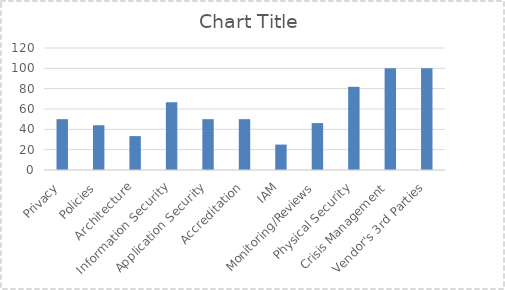
| Category | Series 0 |
|---|---|
| Privacy | 50 |
| Policies | 44 |
| Architecture | 33.333 |
| Information Security | 66.667 |
| Application Security | 50 |
| Accreditation | 50 |
| IAM | 25 |
| Monitoring/Reviews | 46.154 |
| Physical Security | 81.818 |
| Crisis Management | 100 |
| Vendor's 3rd Parties | 100 |